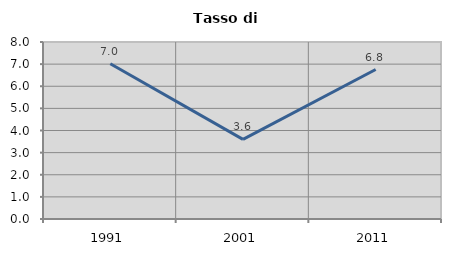
| Category | Tasso di disoccupazione   |
|---|---|
| 1991.0 | 7.018 |
| 2001.0 | 3.597 |
| 2011.0 | 6.757 |